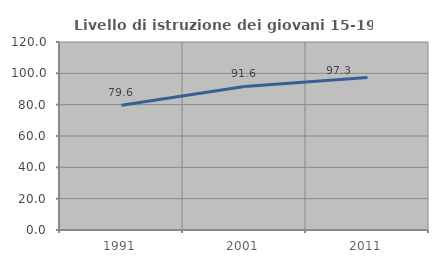
| Category | Livello di istruzione dei giovani 15-19 anni |
|---|---|
| 1991.0 | 79.572 |
| 2001.0 | 91.617 |
| 2011.0 | 97.32 |